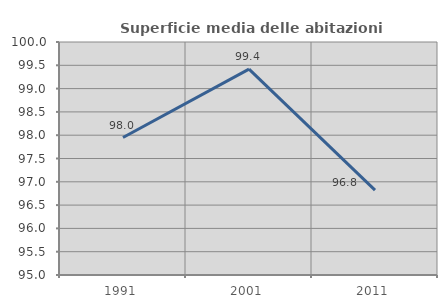
| Category | Superficie media delle abitazioni occupate |
|---|---|
| 1991.0 | 97.95 |
| 2001.0 | 99.418 |
| 2011.0 | 96.822 |